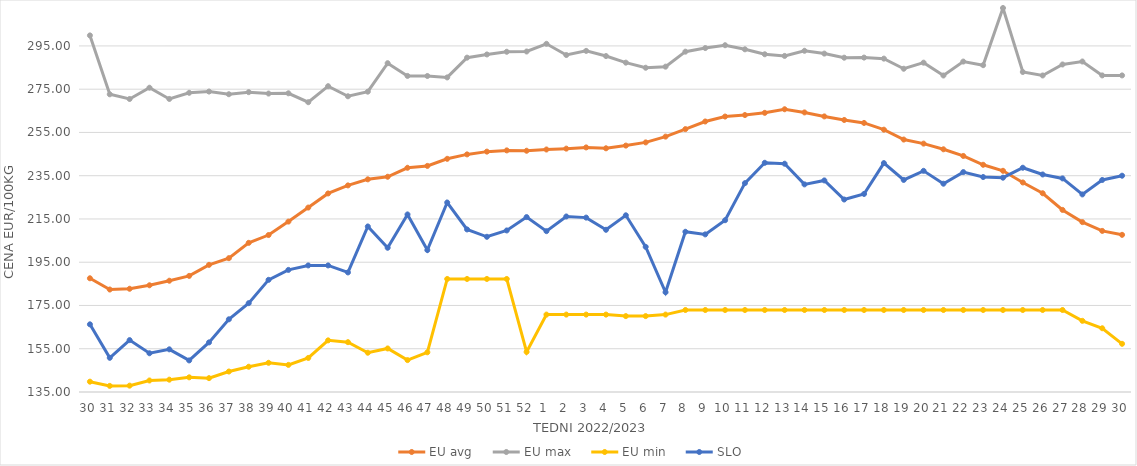
| Category | EU avg | EU max | EU min | SLO |
|---|---|---|---|---|
| 30.0 | 187.576 | 299.87 | 139.777 | 166.29 |
| 31.0 | 182.385 | 272.64 | 137.828 | 150.81 |
| 32.0 | 182.73 | 270.47 | 137.934 | 158.99 |
| 33.0 | 184.343 | 275.68 | 140.33 | 152.91 |
| 34.0 | 186.448 | 270.49 | 140.7 | 154.73 |
| 35.0 | 188.684 | 273.33 | 141.78 | 149.6 |
| 36.0 | 193.792 | 273.91 | 141.41 | 157.93 |
| 37.0 | 196.877 | 272.67 | 144.47 | 168.61 |
| 38.0 | 203.962 | 273.63 | 146.68 | 176.07 |
| 39.0 | 207.574 | 272.98 | 148.499 | 186.86 |
| 40.0 | 213.785 | 273.1 | 147.54 | 191.45 |
| 41.0 | 220.272 | 268.98 | 150.75 | 193.52 |
| 42.0 | 226.803 | 276.39 | 158.87 | 193.52 |
| 43.0 | 230.521 | 271.72 | 158.04 | 190.28 |
| 44.0 | 233.325 | 273.856 | 153.16 | 211.53 |
| 45.0 | 234.517 | 287.021 | 155.13 | 201.69 |
| 46.0 | 238.669 | 281.133 | 149.75 | 217.08 |
| 47.0 | 239.534 | 281.102 | 153.36 | 200.62 |
| 48.0 | 242.81 | 280.434 | 187.26 | 222.61 |
| 49.0 | 244.854 | 289.585 | 187.26 | 210.16 |
| 50.0 | 246.132 | 291.057 | 187.26 | 206.76 |
| 51.0 | 246.705 | 292.307 | 187.26 | 209.69 |
| 52.0 | 246.546 | 292.426 | 153.54 | 215.87 |
| 1.0 | 247.118 | 295.98 | 170.79 | 209.37 |
| 2.0 | 247.516 | 290.8 | 170.79 | 216.15 |
| 3.0 | 248.079 | 292.71 | 170.79 | 215.63 |
| 4.0 | 247.672 | 290.32 | 170.79 | 210 |
| 5.0 | 248.924 | 287.27 | 170.09 | 216.7 |
| 6.0 | 250.4 | 284.92 | 170.09 | 202.1 |
| 7.0 | 253.074 | 285.42 | 170.79 | 181.11 |
| 8.0 | 256.543 | 292.35 | 172.91 | 209.08 |
| 9.0 | 260.066 | 294.02 | 172.91 | 207.87 |
| 10.0 | 262.352 | 295.33 | 172.91 | 214.42 |
| 11.0 | 263.049 | 293.44 | 172.91 | 231.56 |
| 12.0 | 264.068 | 291.15 | 172.91 | 240.97 |
| 13.0 | 265.73 | 290.38 | 172.91 | 240.55 |
| 14.0 | 264.262 | 292.763 | 172.91 | 230.99 |
| 15.0 | 262.411 | 291.46 | 172.91 | 232.82 |
| 16.0 | 260.77 | 289.56 | 172.91 | 224 |
| 17.0 | 259.395 | 289.61 | 172.91 | 226.57 |
| 18.0 | 256.275 | 289.13 | 172.91 | 240.83 |
| 19.0 | 251.716 | 284.45 | 172.91 | 233.05 |
| 20.0 | 249.836 | 287.26 | 172.91 | 237.25 |
| 21.0 | 247.212 | 281.33 | 172.91 | 231.3 |
| 22.0 | 244.135 | 287.77 | 172.91 | 236.67 |
| 23.0 | 240.051 | 286.1 | 172.91 | 234.39 |
| 24.0 | 237.269 | 312.54 | 172.91 | 234.08 |
| 25.0 | 231.874 | 282.95 | 172.91 | 238.69 |
| 26.0 | 226.883 | 281.34 | 172.91 | 235.57 |
| 27.0 | 219.183 | 286.43 | 172.91 | 233.75 |
| 28.0 | 213.546 | 287.8 | 167.9 | 226.35 |
| 29.0 | 209.478 | 281.37 | 164.47 | 233.03 |
| 30.0 | 207.66 | 281.37 | 157.28 | 235 |